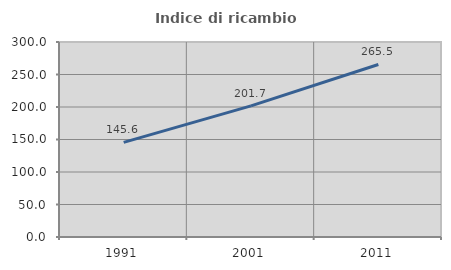
| Category | Indice di ricambio occupazionale  |
|---|---|
| 1991.0 | 145.556 |
| 2001.0 | 201.709 |
| 2011.0 | 265.455 |